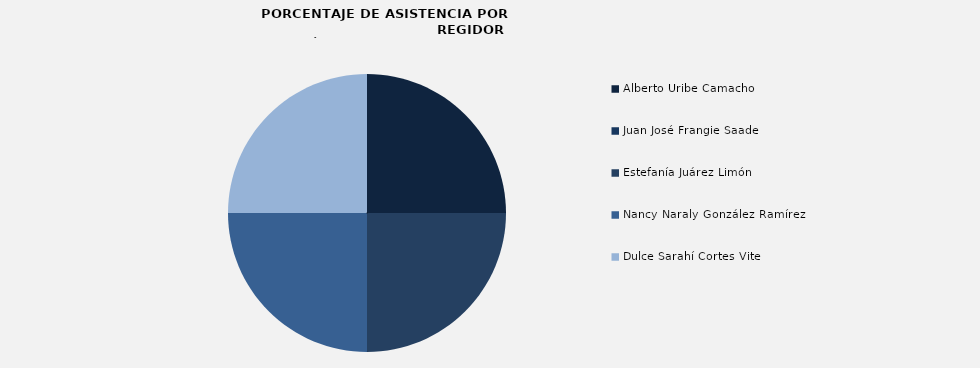
| Category | Alberto Uribe Camacho |
|---|---|
| Alberto Uribe Camacho | 100 |
| Juan José Frangie Saade | 0 |
| Estefanía Juárez Limón | 100 |
| Nancy Naraly González Ramírez | 100 |
| Dulce Sarahí Cortes Vite | 100 |